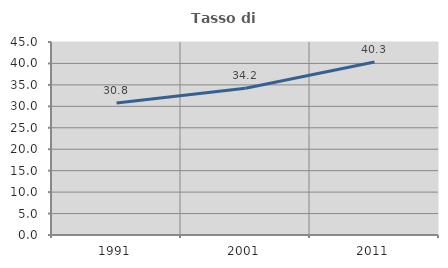
| Category | Tasso di occupazione   |
|---|---|
| 1991.0 | 30.753 |
| 2001.0 | 34.2 |
| 2011.0 | 40.316 |